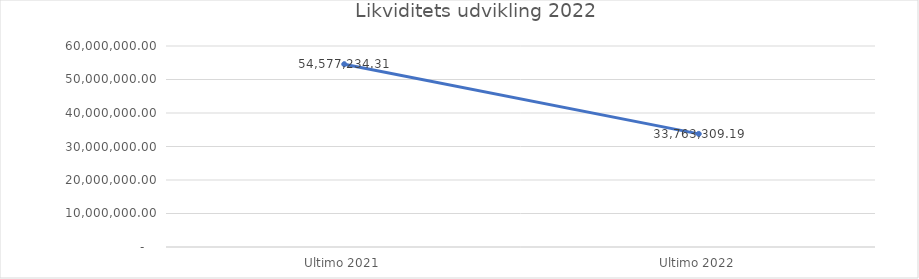
| Category |  Ultimo 2021  |
|---|---|
|  Ultimo 2021  | 54577234.31 |
|  Ultimo 2022  | 33763309.189 |